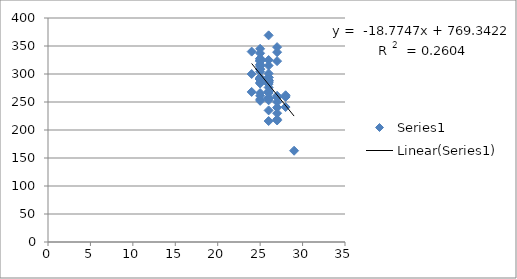
| Category | Series 0 |
|---|---|
| 25.0 | 323 |
| 25.0 | 324 |
| 25.0 | 345 |
| 25.0 | 337 |
| 25.0 | 255 |
| 25.0 | 327 |
| 25.0 | 290 |
| 25.0 | 304 |
| 25.0 | 317 |
| 26.0 | 289 |
| 26.0 | 266 |
| 26.0 | 282 |
| 26.0 | 256 |
| 26.0 | 216 |
| 27.0 | 217 |
| 27.0 | 348 |
| 27.0 | 339 |
| 27.0 | 323 |
| 29.0 | 163 |
| 24.0 | 268 |
| 25.0 | 290 |
| 25.0 | 325 |
| 25.0 | 328 |
| 25.0 | 292 |
| 25.0 | 292 |
| 25.0 | 291 |
| 25.0 | 316 |
| 26.0 | 286 |
| 26.0 | 301 |
| 26.0 | 288 |
| 26.0 | 269 |
| 26.0 | 315 |
| 26.0 | 285 |
| 27.0 | 258 |
| 28.0 | 262 |
| 28.0 | 259 |
| 25.0 | 252 |
| 25.0 | 294 |
| 25.0 | 309 |
| 25.0 | 314 |
| 25.0 | 261 |
| 25.0 | 285 |
| 25.0 | 323 |
| 26.0 | 294 |
| 26.0 | 257 |
| 26.0 | 235 |
| 26.0 | 253 |
| 26.0 | 276 |
| 26.0 | 289 |
| 26.0 | 258 |
| 26.0 | 294 |
| 28.0 | 241 |
| 24.0 | 300 |
| 24.0 | 340 |
| 25.0 | 308 |
| 25.0 | 266 |
| 25.0 | 290 |
| 25.0 | 292 |
| 25.0 | 283 |
| 26.0 | 268 |
| 26.0 | 325 |
| 26.0 | 369 |
| 27.0 | 261 |
| 27.0 | 219 |
| 27.0 | 250 |
| 27.0 | 230 |
| 27.0 | 240 |